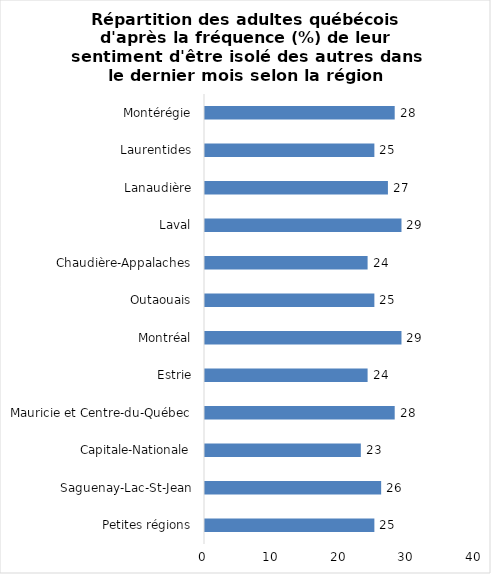
| Category | Series 0 |
|---|---|
| Petites régions | 25 |
| Saguenay-Lac-St-Jean | 26 |
| Capitale-Nationale | 23 |
| Mauricie et Centre-du-Québec | 28 |
| Estrie | 24 |
| Montréal | 29 |
| Outaouais | 25 |
| Chaudière-Appalaches | 24 |
| Laval | 29 |
| Lanaudière | 27 |
| Laurentides | 25 |
| Montérégie | 28 |